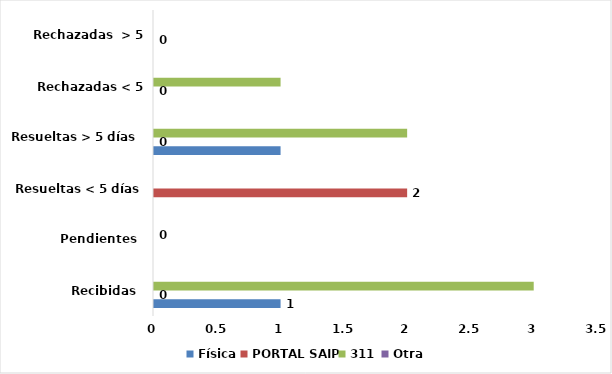
| Category | Física | PORTAL SAIP | 311 | Otra |
|---|---|---|---|---|
| Recibidas  | 1 | 0 | 3 | 0 |
| Pendientes  | 0 | 0 | 0 | 0 |
| Resueltas < 5 días | 0 | 2 | 0 | 0 |
| Resueltas > 5 días  | 1 | 0 | 2 | 0 |
| Rechazadas < 5 días  | 0 | 0 | 1 | 0 |
| Rechazadas  > 5 días | 0 | 0 | 0 | 0 |